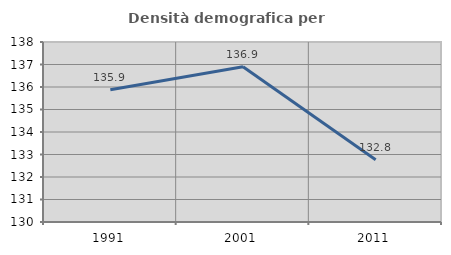
| Category | Densità demografica |
|---|---|
| 1991.0 | 135.878 |
| 2001.0 | 136.898 |
| 2011.0 | 132.769 |